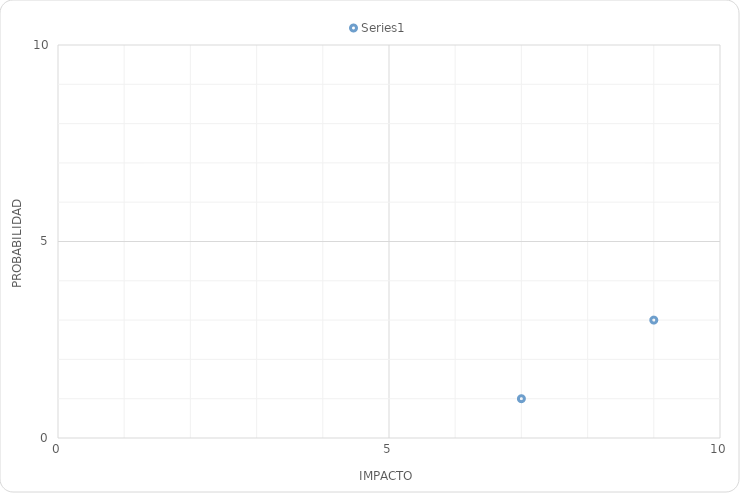
| Category | Series 0 |
|---|---|
| 9.0 | 3 |
| 7.0 | 1 |